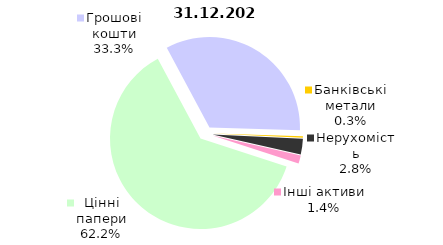
| Category | Series 0 |
|---|---|
| Цінні папери | 2409.121 |
| Грошові кошти | 1290.122 |
| Банківські метали | 10.949 |
| Нерухомість | 108.698 |
| Інші активи | 55.847 |